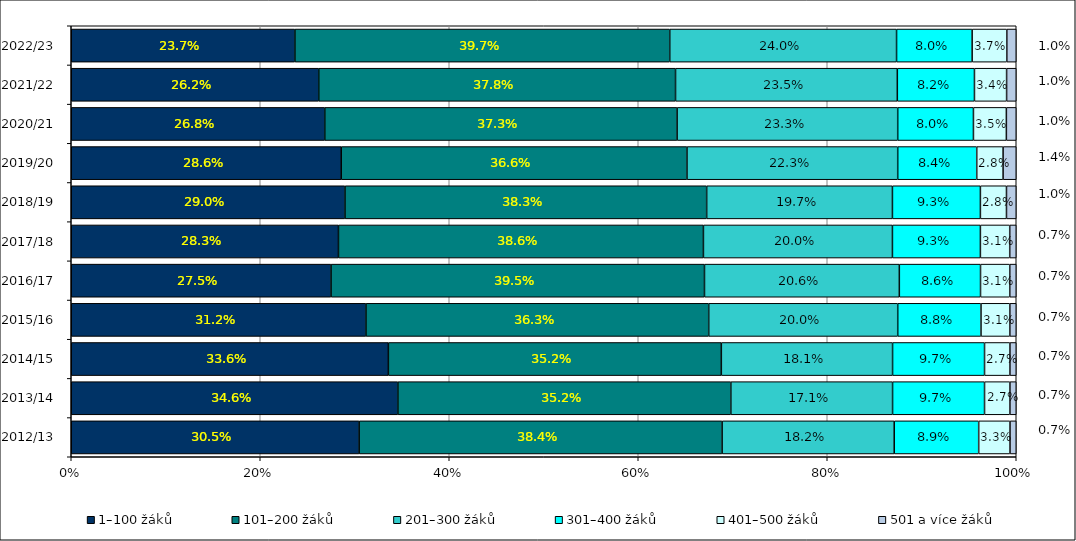
| Category | 1–100 žáků | 101–200 žáků | 201–300 žáků | 301–400 žáků | 401–500 žáků | 501 a více žáků |
|---|---|---|---|---|---|---|
| 2012/13 | 0.305 | 0.384 | 0.182 | 0.089 | 0.033 | 0.007 |
| 2013/14 | 0.346 | 0.352 | 0.171 | 0.097 | 0.027 | 0.007 |
| 2014/15 | 0.336 | 0.352 | 0.181 | 0.097 | 0.027 | 0.007 |
| 2015/16 | 0.312 | 0.363 | 0.2 | 0.088 | 0.031 | 0.007 |
| 2016/17 | 0.275 | 0.395 | 0.206 | 0.086 | 0.031 | 0.007 |
| 2017/18 | 0.283 | 0.386 | 0.2 | 0.093 | 0.031 | 0.007 |
| 2018/19 | 0.29 | 0.383 | 0.197 | 0.093 | 0.028 | 0.01 |
| 2019/20 | 0.286 | 0.366 | 0.223 | 0.084 | 0.028 | 0.014 |
| 2020/21 | 0.268 | 0.373 | 0.233 | 0.08 | 0.035 | 0.01 |
| 2021/22 | 0.262 | 0.378 | 0.235 | 0.082 | 0.034 | 0.01 |
| 2022/23 | 0.237 | 0.397 | 0.24 | 0.08 | 0.037 | 0.01 |